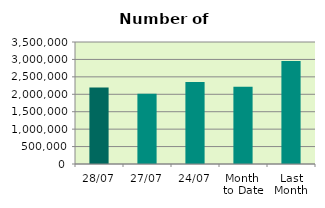
| Category | Series 0 |
|---|---|
| 28/07 | 2194570 |
| 27/07 | 2012448 |
| 24/07 | 2354334 |
| Month 
to Date | 2213800.7 |
| Last
Month | 2956123.091 |